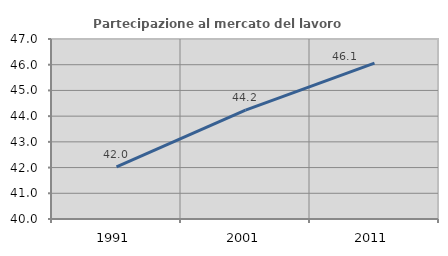
| Category | Partecipazione al mercato del lavoro  femminile |
|---|---|
| 1991.0 | 42.026 |
| 2001.0 | 44.232 |
| 2011.0 | 46.062 |